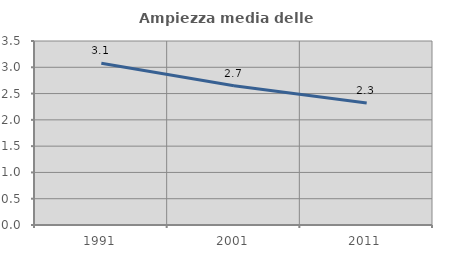
| Category | Ampiezza media delle famiglie |
|---|---|
| 1991.0 | 3.078 |
| 2001.0 | 2.651 |
| 2011.0 | 2.321 |